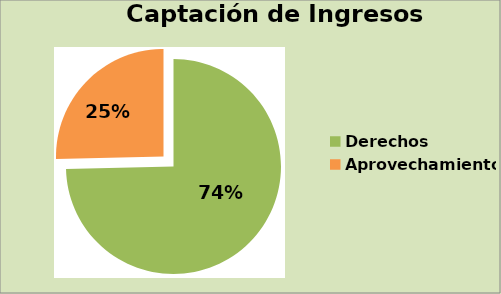
| Category | Series 0 |
|---|---|
| Derechos | 74.363 |
| Aprovechamientos | 25.262 |